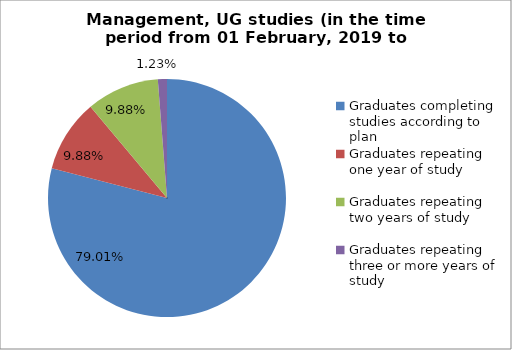
| Category | Series 0 |
|---|---|
| Graduates completing studies according to plan | 79.012 |
| Graduates repeating one year of study | 9.877 |
| Graduates repeating two years of study | 9.877 |
| Graduates repeating three or more years of study | 1.235 |